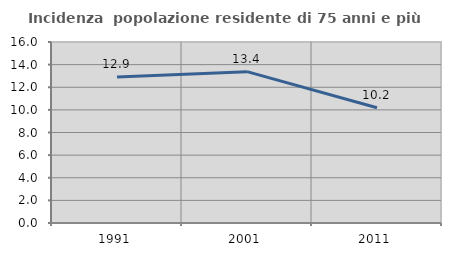
| Category | Incidenza  popolazione residente di 75 anni e più |
|---|---|
| 1991.0 | 12.896 |
| 2001.0 | 13.381 |
| 2011.0 | 10.193 |